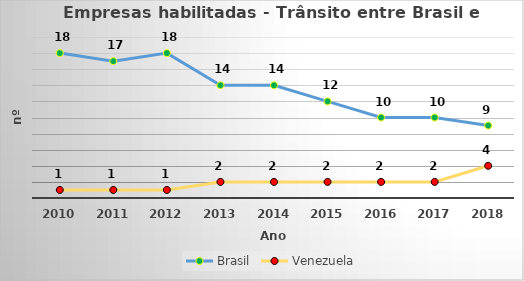
| Category | Brasil | Venezuela |
|---|---|---|
| 2010.0 | 18 | 1 |
| 2011.0 | 17 | 1 |
| 2012.0 | 18 | 1 |
| 2013.0 | 14 | 2 |
| 2014.0 | 14 | 2 |
| 2015.0 | 12 | 2 |
| 2016.0 | 10 | 2 |
| 2017.0 | 10 | 2 |
| 2018.0 | 9 | 4 |